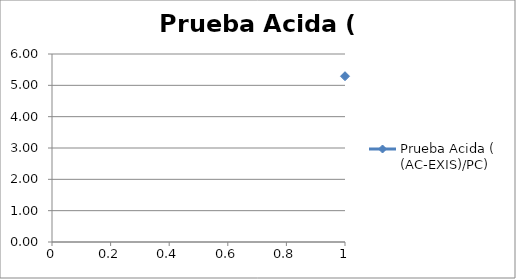
| Category | Prueba Acida ( (AC-EXIS)/PC) |
|---|---|
| 0 | 5.291 |
| 1 | 5.301 |
| 2 | 4.557 |
| 3 | 4.518 |
| 4 | 5.208 |
| 5 | 5.154 |
| 6 | 4.45 |
| 7 | 0.695 |